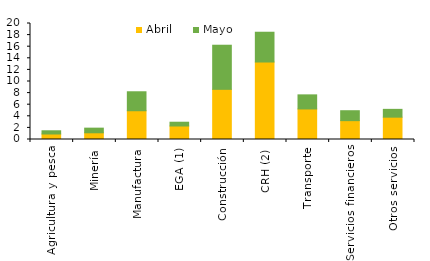
| Category | Abril | Mayo |
|---|---|---|
| Agricultura y pesca | 0.95 | 0.553 |
| Minería | 1.157 | 0.801 |
| Manufactura | 4.959 | 3.27 |
| EGA (1) | 2.327 | 0.653 |
| Construcción | 8.649 | 7.605 |
| CRH (2) | 13.36 | 5.134 |
| Transporte | 5.266 | 2.43 |
| Servicios financieros | 3.251 | 1.711 |
| Otros servicios | 3.851 | 1.346 |